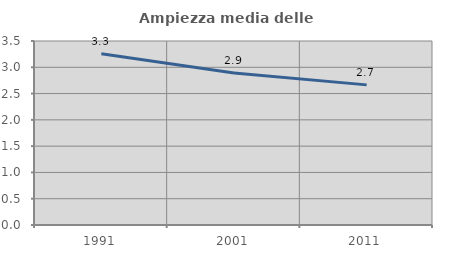
| Category | Ampiezza media delle famiglie |
|---|---|
| 1991.0 | 3.258 |
| 2001.0 | 2.89 |
| 2011.0 | 2.665 |